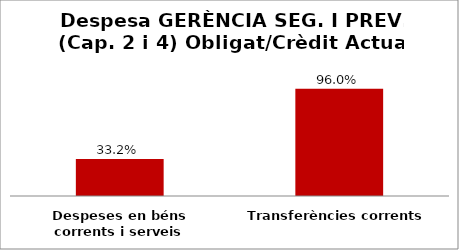
| Category | Series 0 |
|---|---|
| Despeses en béns corrents i serveis | 0.332 |
| Transferències corrents | 0.96 |